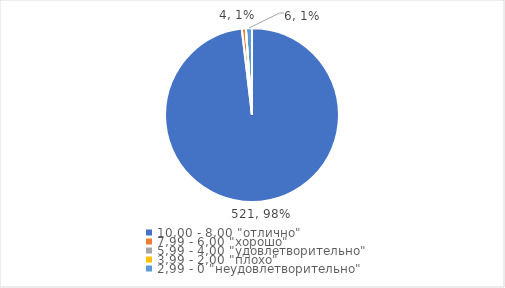
| Category | Series 0 | Series 1 |
|---|---|---|
| 10,00 - 8,00 "отлично" | 521 | 0.981 |
| 7,99 - 6,00 "хорошо" | 4 | 0.008 |
| 5,99 - 4,00 "удовлетворительно" | 0 | 0 |
| 3,99 - 2,00 "плохо" | 0 | 0 |
| 2,99 - 0 "неудовлетворительно" | 6 | 0.011 |